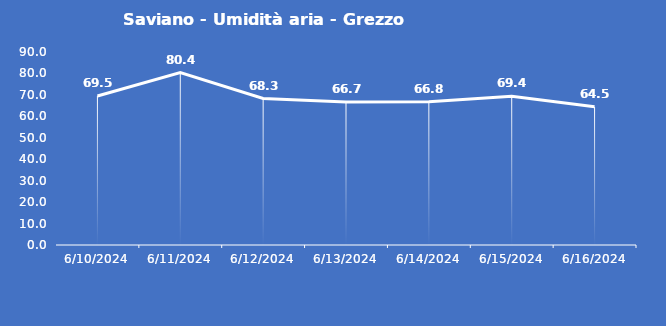
| Category | Saviano - Umidità aria - Grezzo (%) |
|---|---|
| 6/10/24 | 69.5 |
| 6/11/24 | 80.4 |
| 6/12/24 | 68.3 |
| 6/13/24 | 66.7 |
| 6/14/24 | 66.8 |
| 6/15/24 | 69.4 |
| 6/16/24 | 64.5 |